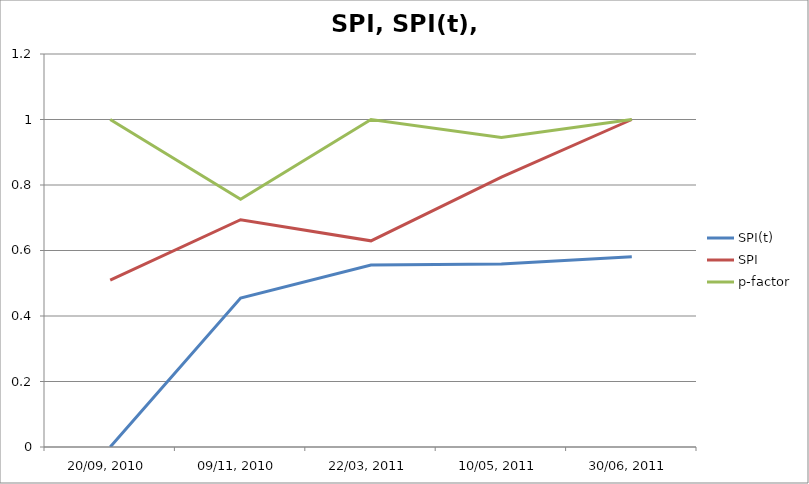
| Category | SPI(t) | SPI | p-factor |
|---|---|---|---|
| 20/09, 2010 | 0 | 0.51 | 1 |
| 09/11, 2010 | 0.455 | 0.694 | 0.757 |
| 22/03, 2011 | 0.556 | 0.629 | 1 |
| 10/05, 2011 | 0.559 | 0.824 | 0.945 |
| 30/06, 2011 | 0.581 | 1 | 1 |